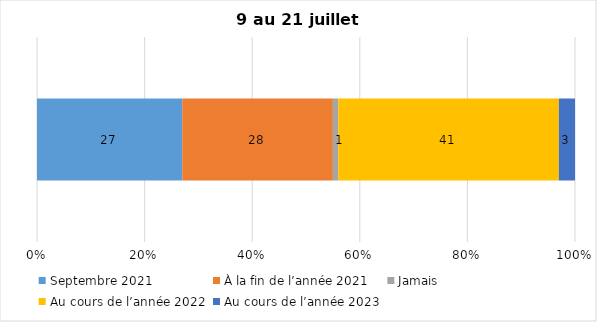
| Category | Septembre 2021 | À la fin de l’année 2021 | Jamais | Au cours de l’année 2022 | Au cours de l’année 2023 |
|---|---|---|---|---|---|
| 0 | 27 | 28 | 1 | 41 | 3 |